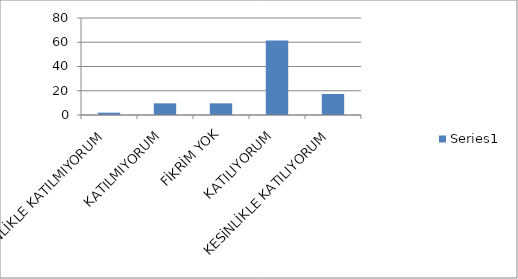
| Category | Series 0 |
|---|---|
| KESİNLİKLE KATILMIYORUM | 1.92 |
| KATILMIYORUM | 9.62 |
| FİKRİM YOK | 9.62 |
| KATILIYORUM | 61.54 |
| KESİNLİKLE KATILIYORUM | 17.31 |